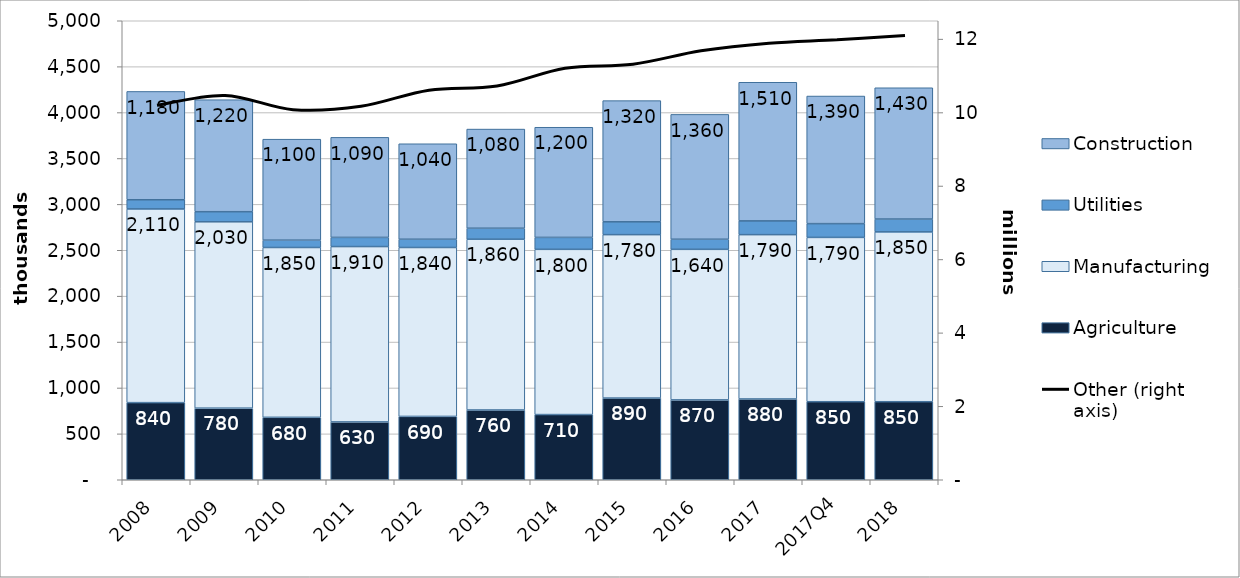
| Category | Agriculture | Manufacturing | Utilities | Construction |
|---|---|---|---|---|
| 2008 | 840 | 2110 | 100 | 1180 |
| 2009 | 780 | 2030 | 110 | 1220 |
| 2010 | 680 | 1850 | 80 | 1100 |
| 2011 | 630 | 1910 | 100 | 1090 |
| 2012 | 690 | 1840 | 90 | 1040 |
| 2013 | 760 | 1860 | 120 | 1080 |
| 2014 | 710 | 1800 | 130 | 1200 |
| 2015 | 890 | 1780 | 140 | 1320 |
| 2016 | 870 | 1640 | 110 | 1360 |
| 2017 | 880 | 1790 | 150 | 1510 |
| 2017Q4 | 850 | 1790 | 150 | 1390 |
| 2018 | 850 | 1850 | 140 | 1430 |